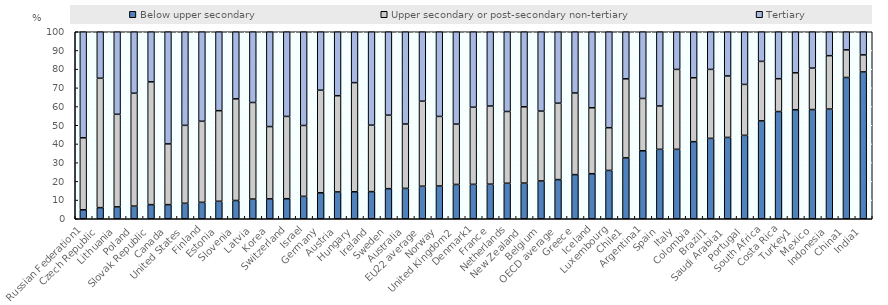
| Category | Below upper secondary | Upper secondary or post-secondary non-tertiary | Tertiary |
|---|---|---|---|
| Russian Federation1 | 4.802 | 38.472 | 56.726 |
| Czech Republic | 5.947 | 69.199 | 24.854 |
| Lithuania | 6.36 | 49.502 | 44.138 |
| Poland | 6.755 | 60.37 | 32.875 |
| Slovak Republic | 7.546 | 65.68 | 26.773 |
| Canada | 7.558 | 32.481 | 59.961 |
| United States | 8.277 | 41.668 | 50.055 |
| Finland | 8.789 | 43.337 | 47.874 |
| Estonia | 9.346 | 48.444 | 42.209 |
| Slovenia | 9.761 | 54.358 | 35.881 |
| Latvia | 10.527 | 51.639 | 37.834 |
| Korea | 10.644 | 38.647 | 50.709 |
| Switzerland | 10.72 | 44.003 | 45.278 |
| Israel | 11.989 | 37.89 | 50.121 |
| Germany | 13.895 | 54.85 | 31.255 |
| Austria | 14.341 | 51.453 | 34.206 |
| Hungary | 14.426 | 58.37 | 27.203 |
| Ireland | 14.507 | 35.549 | 49.944 |
| Sweden | 16.1 | 39.292 | 44.609 |
| Australia | 16.245 | 34.418 | 49.337 |
| EU22 average | 17.398 | 45.472 | 37.13 |
| Norway | 17.519 | 37.208 | 45.273 |
| United Kingdom2 | 18.35 | 32.26 | 49.39 |
| Denmark1 | 18.411 | 41.236 | 40.354 |
| France | 18.511 | 41.772 | 39.717 |
| Netherlands | 18.977 | 38.378 | 42.645 |
| New Zealand | 19.066 | 40.812 | 40.122 |
| Belgium | 20.219 | 37.339 | 42.442 |
| OECD average | 20.946 | 40.837 | 38.597 |
| Greece | 23.604 | 43.652 | 32.744 |
| Iceland | 24.088 | 35.268 | 40.644 |
| Luxembourg | 25.85 | 22.838 | 51.312 |
| Chile1 | 32.552 | 42.279 | 25.168 |
| Argentina1 | 36.359 | 27.977 | 35.664 |
| Spain | 37.135 | 23.178 | 39.687 |
| Italy | 37.138 | 42.726 | 20.136 |
| Colombia | 41.221 | 34.184 | 24.595 |
| Brazil1 | 42.992 | 36.871 | 20.137 |
| Saudi Arabia1 | 43.493 | 32.883 | 23.624 |
| Portugal | 44.603 | 27.232 | 28.164 |
| South Africa | 52.348 | 31.812 | 15.84 |
| Costa Rica | 57.331 | 17.557 | 25.112 |
| Turkey1 | 58.3 | 19.749 | 21.951 |
| Mexico | 58.404 | 22.163 | 19.433 |
| Indonesia | 58.657 | 28.551 | 12.792 |
| China1 | 75.538 | 14.781 | 9.681 |
| India1 | 78.521 | 9.11 | 12.369 |